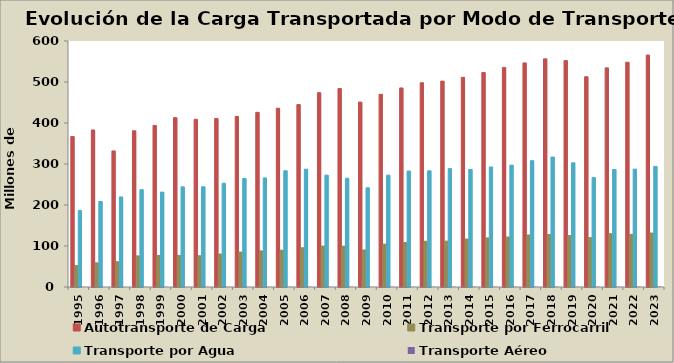
| Category | Autotransporte de Carga | Transporte por Ferrocarril | Transporte por Agua | Transporte Aéreo |
|---|---|---|---|---|
| 1995.0 | 367 | 52.48 | 186.26 | 0.252 |
| 1996.0 | 383 | 58.831 | 208.581 | 0.285 |
| 1997.0 | 332 | 61.666 | 219.653 | 0.335 |
| 1998.0 | 381 | 75.914 | 237.38 | 0.388 |
| 1999.0 | 394 | 77.062 | 231.44 | 0.407 |
| 2000.0 | 413 | 77.164 | 244.252 | 0.379 |
| 2001.0 | 409 | 76.182 | 244.431 | 0.351 |
| 2002.0 | 411 | 80.451 | 253.046 | 0.389 |
| 2003.0 | 416 | 85.168 | 264.739 | 0.41 |
| 2004.0 | 426 | 88.097 | 266.008 | 0.467 |
| 2005.0 | 436 | 89.814 | 283.604 | 0.529 |
| 2006.0 | 445 | 95.713 | 287.432 | 0.544 |
| 2007.0 | 474 | 99.845 | 272.934 | 0.572 |
| 2008.0 | 484 | 99.692 | 265.237 | 0.525 |
| 2009.0 | 451 | 90.321 | 241.923 | 0.466 |
| 2010.0 | 470 | 104.564 | 272.811 | 0.571 |
| 2011.0 | 485.502 | 108.433 | 282.902 | 0.562 |
| 2012.0 | 498.147 | 111.607 | 283.462 | 0.559 |
| 2013.0 | 502.15 | 111.933 | 288.696 | 0.582 |
| 2014.0 | 511.34 | 116.936 | 286.761 | 0.618 |
| 2015.0 | 522.99 | 119.646 | 292.646 | 0.655 |
| 2016.0 | 535.548 | 121.968 | 297.199 | 0.685 |
| 2017.0 | 546.588 | 126.875 | 308.089 | 0.74 |
| 2018.0 | 556.411 | 128.038 | 317.013 | 0.83 |
| 2019.0 | 552.318 | 125.185 | 302.931 | 0.774 |
| 2020.0 | 512.726 | 120.4 | 266.7 | 0.641 |
| 2021.0 | 534.469 | 129.889 | 286.6 | 0.7 |
| 2022.0 | 548.159 | 128.5 | 287.5 | 1.1 |
| 2023.0 | 565.727 | 131.5 | 294.1 | 1.2 |